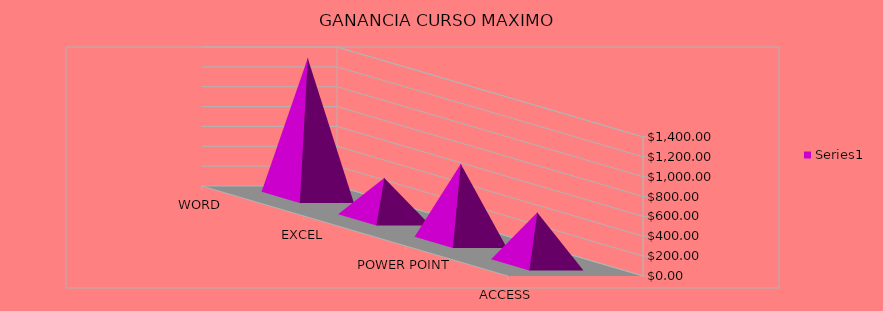
| Category | Series 0 |
|---|---|
| WORD | 1400 |
| EXCEL | 420 |
| POWER POINT | 787.5 |
| ACCESS | 525 |